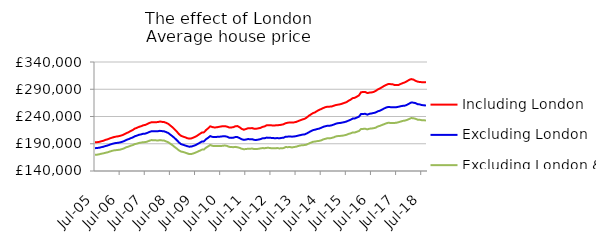
| Category | Including London | Excluding London | Excluding London & SE |
|---|---|---|---|
| 2005-07-01 | 192637.159 | 181907.72 | 169795.831 |
| 2005-08-01 | 192884.354 | 182204.23 | 169987.184 |
| 2005-09-01 | 193456.443 | 182742.056 | 170702.858 |
| 2005-10-01 | 194586.143 | 183737.129 | 171701.029 |
| 2005-11-01 | 195531.81 | 184532.419 | 172389.265 |
| 2005-12-01 | 197150.584 | 185848.339 | 173484.345 |
| 2006-01-01 | 198153.754 | 186784.385 | 174234.386 |
| 2006-02-01 | 199813.466 | 188293.933 | 175667.543 |
| 2006-03-01 | 200983.99 | 189563.153 | 176864.263 |
| 2006-04-01 | 202245.961 | 190631.185 | 177763.943 |
| 2006-05-01 | 203065.042 | 191320.143 | 178237.47 |
| 2006-06-01 | 203685.673 | 191766.348 | 178667.182 |
| 2006-07-01 | 204559.278 | 192518.713 | 179240.302 |
| 2006-08-01 | 205714.078 | 193584.707 | 180374.517 |
| 2006-09-01 | 207431.746 | 195106.329 | 181749.008 |
| 2006-10-01 | 209492.23 | 197111.646 | 183707.283 |
| 2006-11-01 | 211163.513 | 198406.834 | 184803.513 |
| 2006-12-01 | 213373.811 | 200184.26 | 186416.618 |
| 2007-01-01 | 215210.655 | 201535.877 | 187495.779 |
| 2007-02-01 | 217819.553 | 203758.447 | 189382.285 |
| 2007-03-01 | 219232.983 | 204906.873 | 190190.222 |
| 2007-04-01 | 221043.784 | 206461.247 | 191479.848 |
| 2007-05-01 | 222128.218 | 207210.749 | 192197.244 |
| 2007-06-01 | 223865.002 | 208372.622 | 192900.311 |
| 2007-07-01 | 224582.145 | 208580.061 | 193035.973 |
| 2007-08-01 | 226402.251 | 210003.659 | 194051.294 |
| 2007-09-01 | 228182.408 | 211660.89 | 195600.841 |
| 2007-10-01 | 229491.543 | 212979.597 | 196744.628 |
| 2007-11-01 | 229231.088 | 212815.295 | 196339.408 |
| 2007-12-01 | 229404.46 | 212905.332 | 196268.186 |
| 2008-01-01 | 229854.007 | 213027.6 | 195912.124 |
| 2008-02-01 | 230778.597 | 213705.985 | 196694.794 |
| 2008-03-01 | 230153.08 | 213164.837 | 196101.029 |
| 2008-04-01 | 229721.005 | 212737.65 | 195822.963 |
| 2008-05-01 | 228299.829 | 211346.238 | 194168.374 |
| 2008-06-01 | 226513.482 | 209628.718 | 192662.12 |
| 2008-07-01 | 223227.056 | 206570.363 | 189831.839 |
| 2008-08-01 | 220141.088 | 203679.753 | 187225.176 |
| 2008-09-01 | 216463.272 | 200406.398 | 184122.693 |
| 2008-10-01 | 212510.657 | 196770.87 | 181148.64 |
| 2008-11-01 | 207922.628 | 192723.223 | 178029.517 |
| 2008-12-01 | 204675.242 | 189438.674 | 175758.498 |
| 2009-01-01 | 203165.33 | 188120.612 | 174922.017 |
| 2009-02-01 | 201911.844 | 186937.237 | 173762.452 |
| 2009-03-01 | 200225.813 | 185488.87 | 172349.467 |
| 2009-04-01 | 199383.576 | 184697.341 | 171110.985 |
| 2009-05-01 | 199859.253 | 184756.733 | 171205.109 |
| 2009-06-01 | 201412.925 | 186174.835 | 172334.989 |
| 2009-07-01 | 203027.61 | 187480.446 | 173713.12 |
| 2009-08-01 | 205323.71 | 189670.327 | 175544.14 |
| 2009-09-01 | 208069.093 | 191780.428 | 177250.424 |
| 2009-10-01 | 210492.42 | 194114.663 | 179195.013 |
| 2009-11-01 | 210907.6 | 194343.802 | 179474.947 |
| 2009-12-01 | 215086.622 | 198299.021 | 182879.128 |
| 2010-01-01 | 218354.797 | 201001.848 | 185163.534 |
| 2010-02-01 | 222015.55 | 204057.089 | 187708.694 |
| 2010-03-01 | 220623.663 | 202645.504 | 186217.211 |
| 2010-04-01 | 219905.901 | 202176.286 | 185722.593 |
| 2010-05-01 | 220113.626 | 202560.477 | 185660.627 |
| 2010-06-01 | 220921.717 | 202881.827 | 185810.225 |
| 2010-07-01 | 221564.916 | 203122.974 | 185746.775 |
| 2010-08-01 | 222318.029 | 203658.874 | 186337.462 |
| 2010-09-01 | 222269.425 | 203857.033 | 186786.545 |
| 2010-10-01 | 221434.684 | 202970.552 | 186021.486 |
| 2010-11-01 | 219854.924 | 201144.854 | 184354.861 |
| 2010-12-01 | 219866.03 | 200772.354 | 183953.951 |
| 2011-01-01 | 220405.999 | 201085.753 | 183724.506 |
| 2011-02-01 | 222145.885 | 202302.374 | 184279.405 |
| 2011-03-01 | 222431.145 | 202224.902 | 183521.52 |
| 2011-04-01 | 220277.333 | 200405.646 | 182499.86 |
| 2011-05-01 | 217364.071 | 198328.18 | 180845.101 |
| 2011-06-01 | 215781.529 | 197203.528 | 180025.16 |
| 2011-07-01 | 216886.961 | 197679.846 | 180204.195 |
| 2011-08-01 | 218462.386 | 198609.764 | 180911.764 |
| 2011-09-01 | 218447.96 | 198336.118 | 180896.336 |
| 2011-10-01 | 218746.451 | 198390.032 | 181179.074 |
| 2011-11-01 | 217505.539 | 197130.138 | 180183.324 |
| 2011-12-01 | 217590.911 | 196985.648 | 180310.287 |
| 2012-01-01 | 218300.924 | 197626.217 | 180700.792 |
| 2012-02-01 | 219064.04 | 198509.293 | 181516.234 |
| 2012-03-01 | 220982.893 | 200008.532 | 182063.76 |
| 2012-04-01 | 221888.073 | 200155.168 | 181813.842 |
| 2012-05-01 | 224080.255 | 201265.513 | 182442.614 |
| 2012-06-01 | 224094.767 | 201103.147 | 182450.163 |
| 2012-07-01 | 223904.739 | 200785.472 | 181887.565 |
| 2012-08-01 | 223391.425 | 200470.454 | 181782.505 |
| 2012-09-01 | 223676.621 | 200097.203 | 181530.42 |
| 2012-10-01 | 224076.65 | 200441.649 | 182155.422 |
| 2012-11-01 | 224222.02 | 199942.059 | 181394.869 |
| 2012-12-01 | 224932.069 | 200752.198 | 181819.304 |
| 2013-01-01 | 225725.691 | 200982.997 | 181992.077 |
| 2013-02-01 | 227657.684 | 202887.461 | 183982.638 |
| 2013-03-01 | 228536.318 | 203048.201 | 183714.128 |
| 2013-04-01 | 229161.736 | 203446.577 | 184041.738 |
| 2013-05-01 | 228933.746 | 202978.692 | 183179.668 |
| 2013-06-01 | 229215.618 | 203313.988 | 184002.652 |
| 2013-07-01 | 230067.874 | 204001.956 | 184567.567 |
| 2013-08-01 | 231582.352 | 204974.592 | 185829.063 |
| 2013-09-01 | 233071.269 | 205820.443 | 186816.952 |
| 2013-10-01 | 234544.706 | 206712.595 | 187392.956 |
| 2013-11-01 | 235649.654 | 207108.713 | 187518.32 |
| 2013-12-01 | 237829.132 | 208690.471 | 188380.852 |
| 2014-01-01 | 241172.518 | 210845.071 | 190258.481 |
| 2014-02-01 | 243555.901 | 212961.021 | 191924.926 |
| 2014-03-01 | 246091.044 | 214920.699 | 193529.609 |
| 2014-04-01 | 247497.872 | 215742.692 | 194071.52 |
| 2014-05-01 | 250020.497 | 216873.39 | 194767.88 |
| 2014-06-01 | 252131.969 | 217799.223 | 195254.109 |
| 2014-07-01 | 253728.94 | 219290.342 | 196257.739 |
| 2014-08-01 | 255600.623 | 221085.588 | 198018.95 |
| 2014-09-01 | 257111.229 | 222135.43 | 199079.718 |
| 2014-10-01 | 258073.581 | 223029.625 | 200160.045 |
| 2014-11-01 | 258087.083 | 223011.964 | 199843.07 |
| 2014-12-01 | 258355.146 | 223877.078 | 200718.802 |
| 2015-01-01 | 259818.582 | 225210.893 | 201785.11 |
| 2015-02-01 | 261058.597 | 226814.296 | 203490.572 |
| 2015-03-01 | 261701.1 | 227767.121 | 204141.593 |
| 2015-04-01 | 262401.663 | 228109.591 | 204365.531 |
| 2015-05-01 | 263522.572 | 228848.656 | 204714.335 |
| 2015-06-01 | 265038.057 | 229662.855 | 205471.122 |
| 2015-07-01 | 266149.558 | 230709.975 | 206333.662 |
| 2015-08-01 | 268751.273 | 232422.039 | 208026.359 |
| 2015-09-01 | 270772.804 | 233951.289 | 209022.454 |
| 2015-10-01 | 273642.208 | 236127.485 | 210714.392 |
| 2015-11-01 | 274283.861 | 236389.602 | 210643.36 |
| 2015-12-01 | 276419.926 | 238068.942 | 212021.052 |
| 2016-01-01 | 278666.894 | 239684.952 | 213316.584 |
| 2016-02-01 | 284429.326 | 244573.995 | 217105.031 |
| 2016-03-01 | 284960.108 | 244731.444 | 217261.044 |
| 2016-04-01 | 284944.646 | 244897.165 | 217499.971 |
| 2016-05-01 | 282948.008 | 243398.657 | 216367.949 |
| 2016-06-01 | 283814.098 | 244972.216 | 217645.462 |
| 2016-07-01 | 284190.963 | 245619.864 | 217954.862 |
| 2016-08-01 | 285049.367 | 246455.532 | 218604.261 |
| 2016-09-01 | 286912.583 | 247394.501 | 219476.719 |
| 2016-10-01 | 289670.712 | 249511.292 | 221752.508 |
| 2016-11-01 | 291498.925 | 250634.807 | 222803.879 |
| 2016-12-01 | 293655.099 | 252651.295 | 224422.212 |
| 2017-01-01 | 296047.311 | 254646.13 | 225834.96 |
| 2017-02-01 | 297925.438 | 256462.218 | 227396.673 |
| 2017-03-01 | 299546.833 | 257574.091 | 228510.012 |
| 2017-04-01 | 299413.526 | 257171.778 | 228194.603 |
| 2017-05-01 | 299164.728 | 257151.732 | 228274.956 |
| 2017-06-01 | 297838.49 | 256753.308 | 228150.344 |
| 2017-07-01 | 297571.642 | 257197.937 | 228698.775 |
| 2017-08-01 | 297916.065 | 257964.625 | 229614.952 |
| 2017-09-01 | 299814.9 | 258876.291 | 230808.11 |
| 2017-10-01 | 301359.627 | 259621.643 | 231939.65 |
| 2017-11-01 | 302706.284 | 259978.584 | 232558.991 |
| 2017-12-01 | 304865.556 | 261531.17 | 233735.688 |
| 2018-01-01 | 307281.647 | 263681.389 | 235419.708 |
| 2018-02-01 | 308648.891 | 265746.744 | 237171.861 |
| 2018-03-01 | 307721 | 265401.695 | 236780.701 |
| 2018-04-01 | 305573.845 | 264575.949 | 235877.394 |
| 2018-05-01 | 303996.5 | 262659.22 | 234214.76 |
| 2018-06-01 | 303305.842 | 262222.666 | 234034.995 |
| 2018-07-01 | 302996.161 | 260959.964 | 233195.703 |
| 2018-08-01 | 303041.731 | 260687.486 | 233113.345 |
| 2018-09-01 | 302626.478 | 259892.667 | 232570.166 |